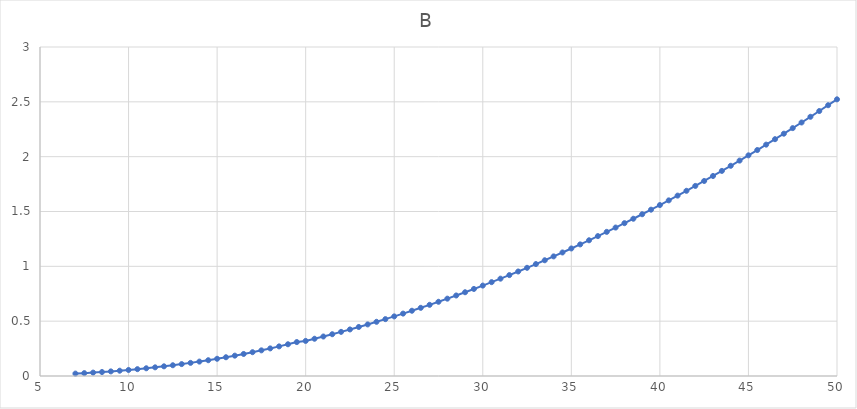
| Category | B |
|---|---|
| 7.0 | 0.022 |
| 7.5 | 0.026 |
| 8.0 | 0.031 |
| 8.5 | 0.036 |
| 9.0 | 0.042 |
| 9.5 | 0.048 |
| 10.0 | 0.055 |
| 10.5 | 0.062 |
| 11.0 | 0.07 |
| 11.5 | 0.079 |
| 12.0 | 0.088 |
| 12.5 | 0.098 |
| 13.0 | 0.108 |
| 13.5 | 0.12 |
| 14.0 | 0.131 |
| 14.5 | 0.144 |
| 15.0 | 0.157 |
| 15.5 | 0.171 |
| 16.0 | 0.186 |
| 16.5 | 0.201 |
| 17.0 | 0.217 |
| 17.5 | 0.234 |
| 18.0 | 0.252 |
| 18.5 | 0.27 |
| 19.0 | 0.289 |
| 19.5 | 0.309 |
| 20.0 | 0.32 |
| 20.5 | 0.34 |
| 21.0 | 0.36 |
| 21.5 | 0.381 |
| 22.0 | 0.402 |
| 22.5 | 0.425 |
| 23.0 | 0.447 |
| 23.5 | 0.47 |
| 24.0 | 0.494 |
| 24.5 | 0.519 |
| 25.0 | 0.543 |
| 25.5 | 0.569 |
| 26.0 | 0.595 |
| 26.5 | 0.622 |
| 27.0 | 0.649 |
| 27.5 | 0.677 |
| 28.0 | 0.705 |
| 28.5 | 0.734 |
| 29.0 | 0.764 |
| 29.5 | 0.794 |
| 30.0 | 0.824 |
| 30.5 | 0.856 |
| 31.0 | 0.888 |
| 31.5 | 0.92 |
| 32.0 | 0.953 |
| 32.5 | 0.987 |
| 33.0 | 1.021 |
| 33.5 | 1.055 |
| 34.0 | 1.091 |
| 34.5 | 1.126 |
| 35.0 | 1.163 |
| 35.5 | 1.2 |
| 36.0 | 1.238 |
| 36.5 | 1.276 |
| 37.0 | 1.314 |
| 37.5 | 1.354 |
| 38.0 | 1.394 |
| 38.5 | 1.434 |
| 39.0 | 1.475 |
| 39.5 | 1.517 |
| 40.0 | 1.559 |
| 40.5 | 1.602 |
| 41.0 | 1.645 |
| 41.5 | 1.689 |
| 42.0 | 1.733 |
| 42.5 | 1.778 |
| 43.0 | 1.824 |
| 43.5 | 1.87 |
| 44.0 | 1.917 |
| 44.5 | 1.964 |
| 45.0 | 2.012 |
| 45.5 | 2.061 |
| 46.0 | 2.11 |
| 46.5 | 2.159 |
| 47.0 | 2.21 |
| 47.5 | 2.26 |
| 48.0 | 2.312 |
| 48.5 | 2.364 |
| 49.0 | 2.416 |
| 49.5 | 2.469 |
| 50.0 | 2.523 |